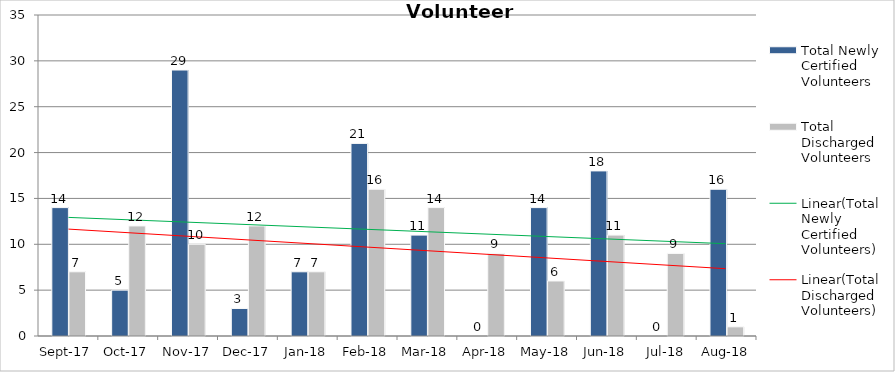
| Category | Total Newly Certified Volunteers | Total Discharged Volunteers |
|---|---|---|
| 2017-09-01 | 14 | 7 |
| 2017-10-01 | 5 | 12 |
| 2017-11-01 | 29 | 10 |
| 2017-12-01 | 3 | 12 |
| 2018-01-01 | 7 | 7 |
| 2018-02-01 | 21 | 16 |
| 2018-03-01 | 11 | 14 |
| 2018-04-01 | 0 | 9 |
| 2018-05-01 | 14 | 6 |
| 2018-06-01 | 18 | 11 |
| 2018-07-01 | 0 | 9 |
| 2018-08-01 | 16 | 1 |